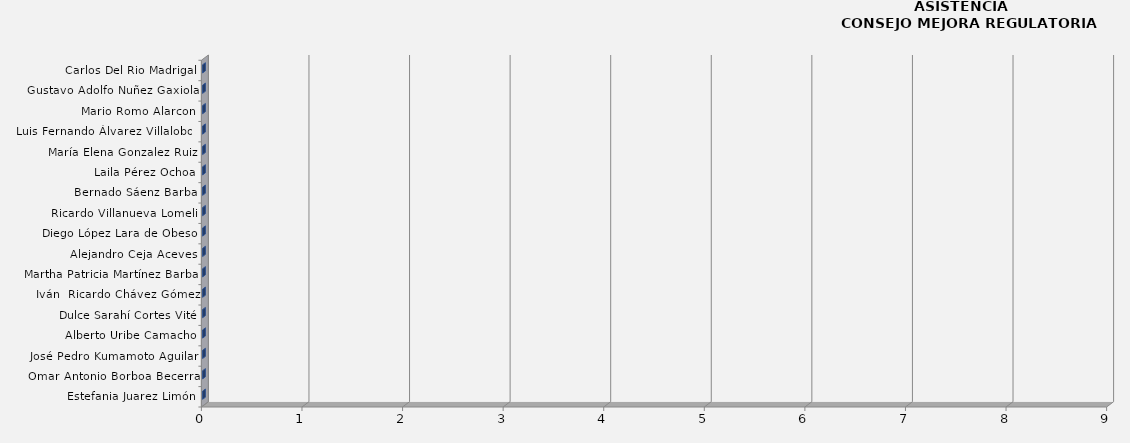
| Category | Series 0 |
|---|---|
| Estefania Juarez Limón | 0 |
| Omar Antonio Borboa Becerra | 0 |
| José Pedro Kumamoto Aguilar | 0 |
| Alberto Uribe Camacho | 0 |
| Dulce Sarahí Cortes Vité | 0 |
| Iván  Ricardo Chávez Gómez | 0 |
| Martha Patricia Martínez Barba | 0 |
| Alejandro Ceja Aceves | 0 |
| Diego López Lara de Obeso | 0 |
| Ricardo Villanueva Lomeli | 0 |
| Bernado Sáenz Barba | 0 |
| Laila Pérez Ochoa | 0 |
| María Elena Gonzalez Ruiz | 0 |
| Luis Fernando Álvarez Villalobos | 0 |
| Mario Romo Alarcon | 0 |
| Gustavo Adolfo Nuñez Gaxiola | 0 |
| Carlos Del Rio Madrigal | 0 |